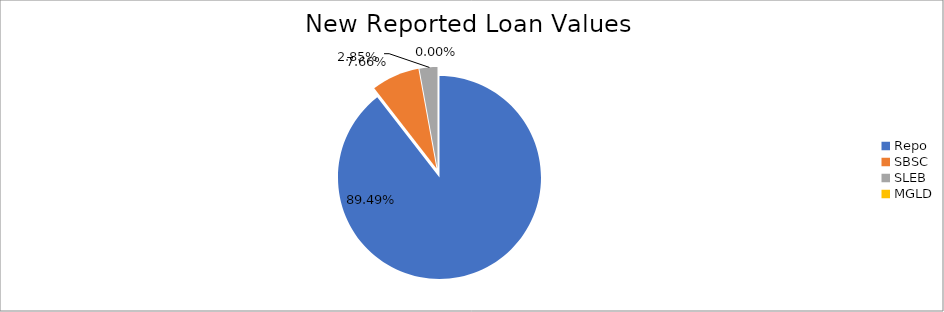
| Category | Series 0 |
|---|---|
| Repo | 12127570.397 |
| SBSC | 1037472.188 |
| SLEB | 386364.142 |
| MGLD | 180.141 |